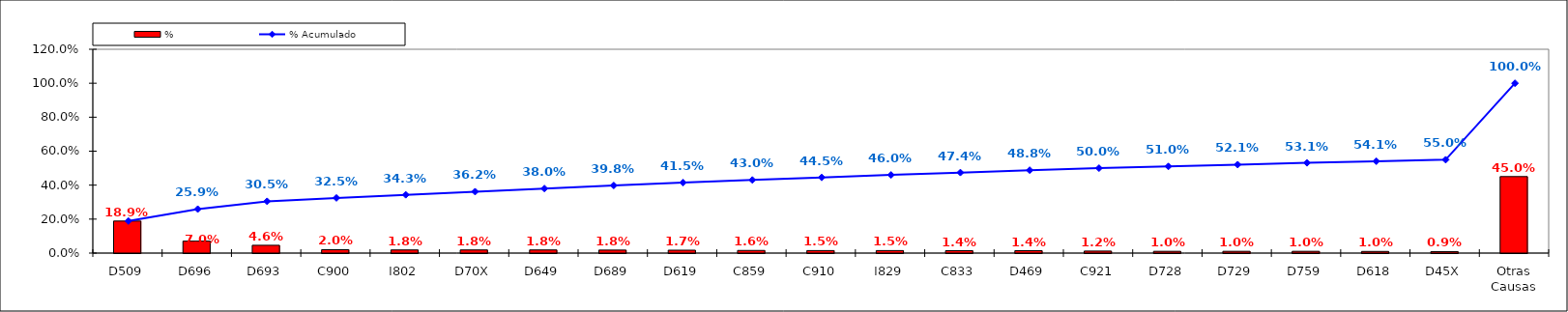
| Category | % |
|---|---|
| D509 | 0.189 |
| D696 | 0.07 |
| D693 | 0.046 |
| C900 | 0.02 |
| I802 | 0.018 |
| D70X | 0.018 |
| D649 | 0.018 |
| D689 | 0.018 |
| D619 | 0.017 |
| C859 | 0.016 |
| C910 | 0.015 |
| I829 | 0.015 |
| C833 | 0.014 |
| D469 | 0.014 |
| C921 | 0.012 |
| D728 | 0.01 |
| D729 | 0.01 |
| D759 | 0.01 |
| D618 | 0.01 |
| D45X | 0.009 |
| Otras Causas | 0.45 |